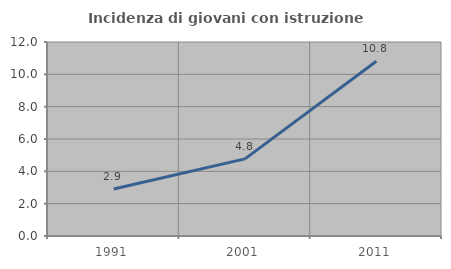
| Category | Incidenza di giovani con istruzione universitaria |
|---|---|
| 1991.0 | 2.904 |
| 2001.0 | 4.77 |
| 2011.0 | 10.811 |